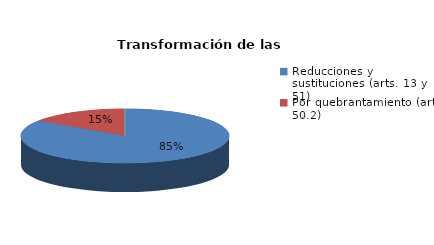
| Category | Series 0 |
|---|---|
| Reducciones y sustituciones (arts. 13 y 51) | 11 |
| Por quebrantamiento (art. 50.2) | 2 |
| Cancelaciones anticipadas | 0 |
| Traslado a Centros Penitenciarios | 0 |
| Conversión internamientos en cerrados (art. 51.2) | 0 |